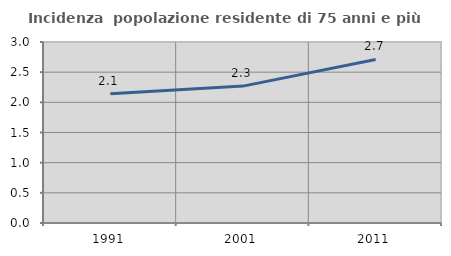
| Category | Incidenza  popolazione residente di 75 anni e più |
|---|---|
| 1991.0 | 2.143 |
| 2001.0 | 2.269 |
| 2011.0 | 2.711 |